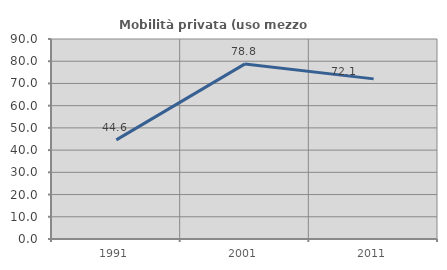
| Category | Mobilità privata (uso mezzo privato) |
|---|---|
| 1991.0 | 44.595 |
| 2001.0 | 78.788 |
| 2011.0 | 72.059 |